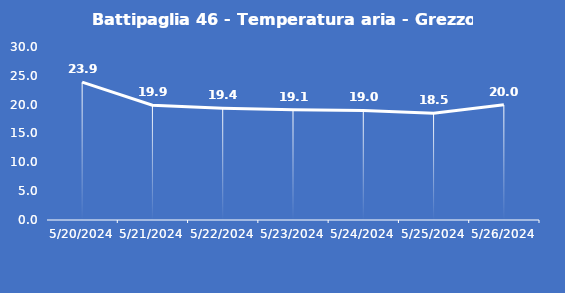
| Category | Battipaglia 46 - Temperatura aria - Grezzo (°C) |
|---|---|
| 5/20/24 | 23.9 |
| 5/21/24 | 19.9 |
| 5/22/24 | 19.4 |
| 5/23/24 | 19.1 |
| 5/24/24 | 19 |
| 5/25/24 | 18.5 |
| 5/26/24 | 20 |